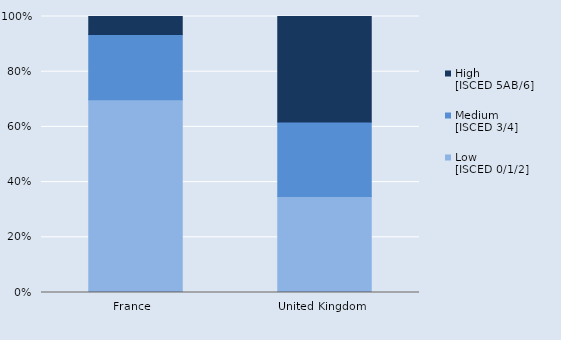
| Category | Low 
[ISCED 0/1/2] | Medium
[ISCED 3/4] | High 
[ISCED 5AB/6] |
|---|---|---|---|
| France  | 410850 | 139157 | 38211 |
| United Kingdom  | 27578 | 21312 | 30309 |